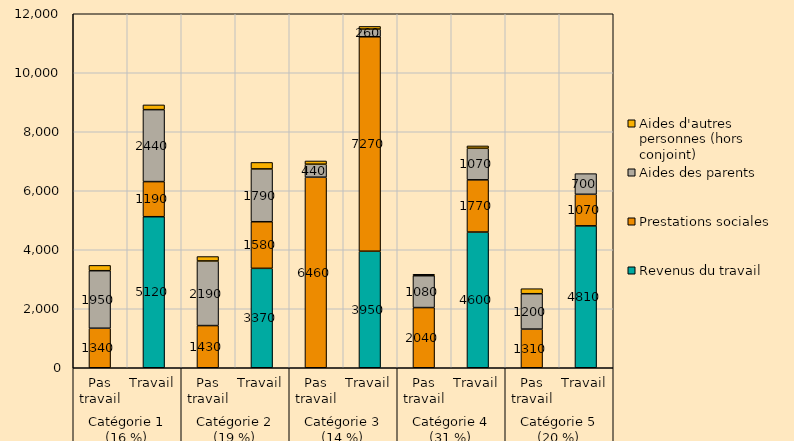
| Category | Revenus du travail | Prestations sociales | Aides des parents | Aides d'autres personnes (hors conjoint) |
|---|---|---|---|---|
| 0 | 0 | 1340 | 1950 | 180 |
| 1 | 5120 | 1190 | 2440 | 160 |
| 2 | 0 | 1430 | 2190 | 150 |
| 3 | 3370 | 1580 | 1790 | 220 |
| 4 | 0 | 6460 | 440 | 110 |
| 5 | 3950 | 7270 | 260 | 90 |
| 6 | 0 | 2040 | 1080 | 50 |
| 7 | 4600 | 1770 | 1070 | 80 |
| 8 | 0 | 1310 | 1200 | 170 |
| 9 | 4810 | 1070 | 700 | 0 |